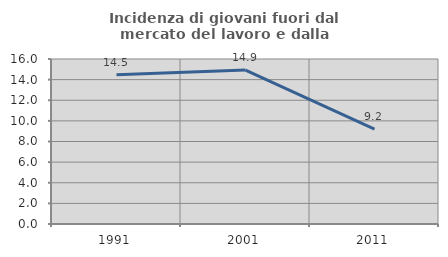
| Category | Incidenza di giovani fuori dal mercato del lavoro e dalla formazione  |
|---|---|
| 1991.0 | 14.477 |
| 2001.0 | 14.925 |
| 2011.0 | 9.208 |